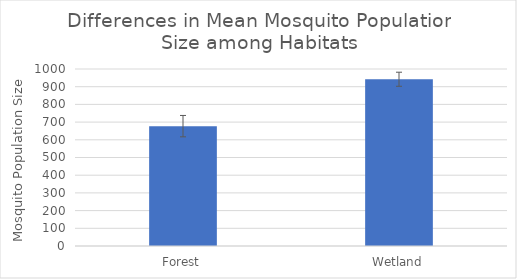
| Category | Series 0 |
|---|---|
| Forest | 677.143 |
| Wetland | 942.143 |